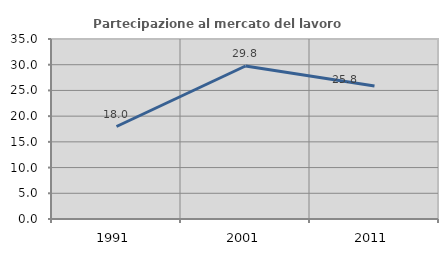
| Category | Partecipazione al mercato del lavoro  femminile |
|---|---|
| 1991.0 | 17.986 |
| 2001.0 | 29.752 |
| 2011.0 | 25.843 |